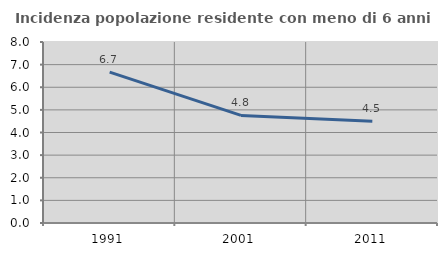
| Category | Incidenza popolazione residente con meno di 6 anni |
|---|---|
| 1991.0 | 6.667 |
| 2001.0 | 4.756 |
| 2011.0 | 4.501 |